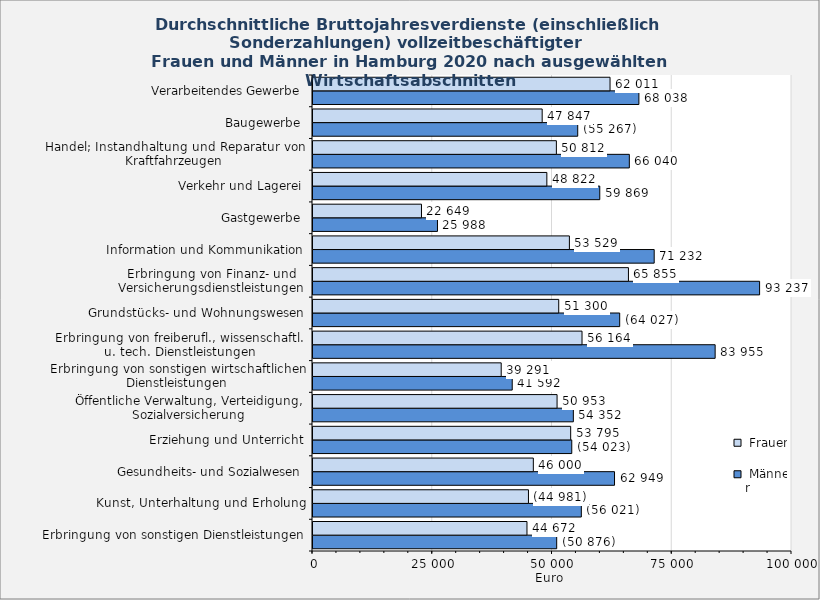
| Category |  Männer |  Frauen |
|---|---|---|
| Erbringung von sonstigen Dienstleistungen | 50876 | 44672 |
| Kunst, Unterhaltung und Erholung | 56021 | 44981 |
| Gesundheits- und Sozialwesen | 62949 | 46000 |
| Erziehung und Unterricht | 54023 | 53795 |
| Öffentliche Verwaltung, Verteidigung, Sozialversicherung | 54352 | 50953 |
| Erbringung von sonstigen wirtschaftlichen Dienstleistungen | 41592 | 39291 |
| Erbringung von freiberufl., wissenschaftl. u. tech. Dienstleistungen | 83955 | 56164 |
| Grundstücks- und Wohnungswesen | 64027 | 51300 |
| Erbringung von Finanz- und Versicherungsdienstleistungen | 93237 | 65855 |
| Information und Kommunikation | 71232 | 53529 |
| Gastgewerbe | 25988 | 22649 |
| Verkehr und Lagerei | 59869 | 48822 |
| Handel; Instandhaltung und Reparatur von Kraftfahrzeugen | 66040 | 50812 |
| Baugewerbe | 55267 | 47847 |
| Verarbeitendes Gewerbe | 68038 | 62011 |